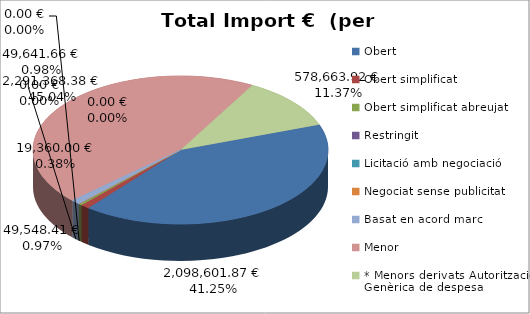
| Category | Total preu              (amb iva) |
|---|---|
| Obert | 2098601.87 |
| Obert simplificat | 49548.41 |
| Obert simplificat abreujat | 19360 |
| Restringit | 0 |
| Licitació amb negociació | 0 |
| Negociat sense publicitat | 0 |
| Basat en acord marc | 49641.66 |
| Menor | 2291368.38 |
| * Menors derivats Autorització Genèrica de despesa | 578663.92 |